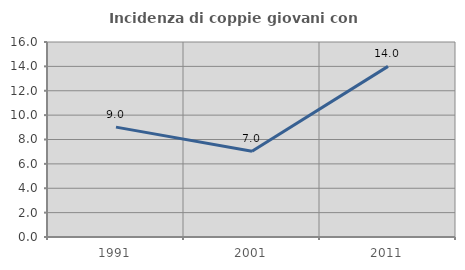
| Category | Incidenza di coppie giovani con figli |
|---|---|
| 1991.0 | 9.016 |
| 2001.0 | 7.031 |
| 2011.0 | 14 |